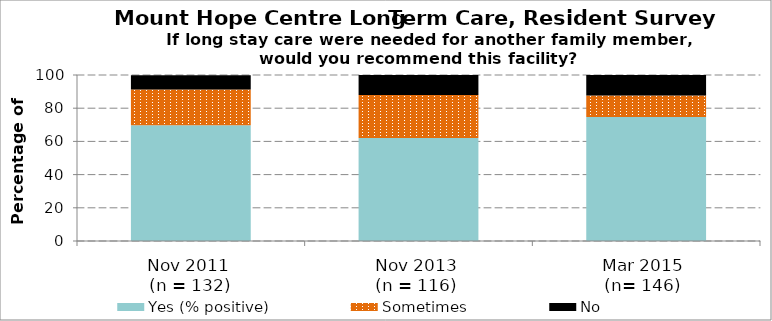
| Category | Yes (% positive) | Sometimes | No |
|---|---|---|---|
| Nov 2011 
(n = 132) | 69.8 | 21.4 | 8.7 |
| Nov 2013 
(n = 116)  | 62 | 26 | 12 |
| Mar 2015 
(n= 146)  | 74.7 | 13 | 12.3 |